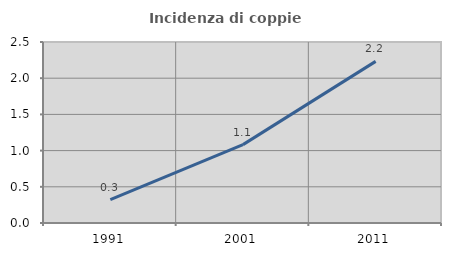
| Category | Incidenza di coppie miste |
|---|---|
| 1991.0 | 0.323 |
| 2001.0 | 1.083 |
| 2011.0 | 2.233 |